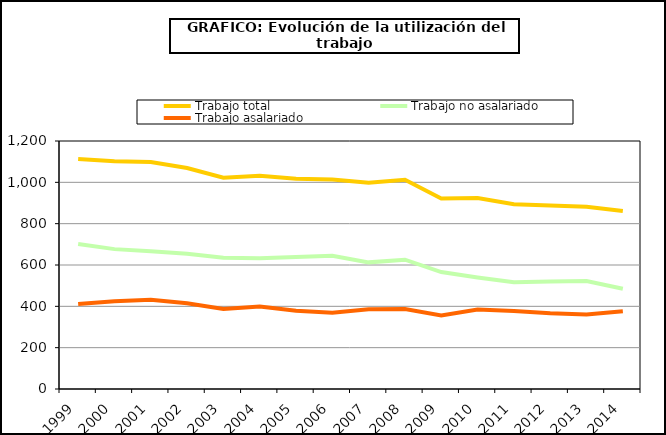
| Category | Trabajo total | Trabajo no asalariado | Trabajo asalariado |
|---|---|---|---|
| 1999.0 | 1112.739 | 701.172 | 411.567 |
| 2000.0 | 1101.451 | 676.79 | 424.661 |
| 2001.0 | 1098.738 | 666.463 | 432.275 |
| 2002.0 | 1069.314 | 654.029 | 415.285 |
| 2003.0 | 1022.665 | 635.076 | 387.589 |
| 2004.0 | 1032.156 | 632.785 | 399.371 |
| 2005.0 | 1017.234 | 638.883 | 378.351 |
| 2006.0 | 1013.286 | 644.545 | 368.741 |
| 2007.0 | 998.234 | 612.743 | 385.491 |
| 2008.0 | 1012.396 | 625.532 | 386.864 |
| 2009.0 | 922.026 | 565.965 | 356.062 |
| 2010.0 | 924.172 | 539.948 | 384.224 |
| 2011.0 | 894.121 | 516.318 | 377.803 |
| 2012.0 | 887.335 | 520.54 | 366.795 |
| 2013.0 | 882.093 | 522.057 | 360.036 |
| 2014.0 | 861.182 | 484.889 | 376.293 |